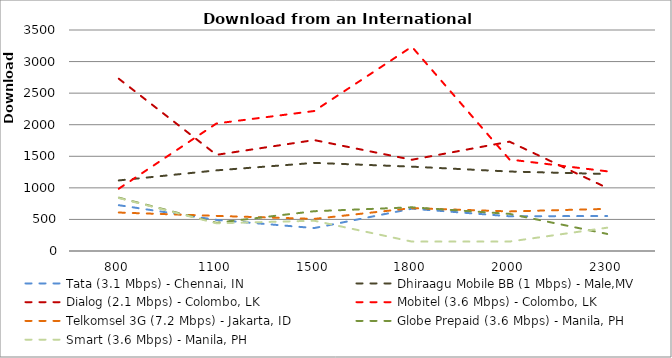
| Category | Tata (3.1 Mbps) - Chennai, IN | Dhiraagu Mobile BB (1 Mbps) - Male,MV | Dialog (2.1 Mbps) - Colombo, LK | Mobitel (3.6 Mbps) - Colombo, LK | Telkomsel 3G (7.2 Mbps) - Jakarta, ID | Globe Prepaid (3.6 Mbps) - Manila, PH | Smart (3.6 Mbps) - Manila, PH |
|---|---|---|---|---|---|---|---|
| 800.0 | 725.25 | 1117.615 | 2727.75 | 986.75 | 609.333 | 844.5 | 839 |
| 1100.0 | 492.5 | 1277.083 | 1523 | 2019.75 | 556 | 446.25 | 438.5 |
| 1500.0 | 363 | 1395.462 | 1756.75 | 2216.75 | 508.25 | 630.25 | 479.5 |
| 1800.0 | 670 | 1336 | 1445 | 3235 | 679 | 692 | 149.25 |
| 2000.0 | 550.25 | 1258.692 | 1731.75 | 1449.25 | 627 | 588 | 149.25 |
| 2300.0 | 554 | 1219.154 | 999.5 | 1262 | 667.25 | 270.5 | 369 |